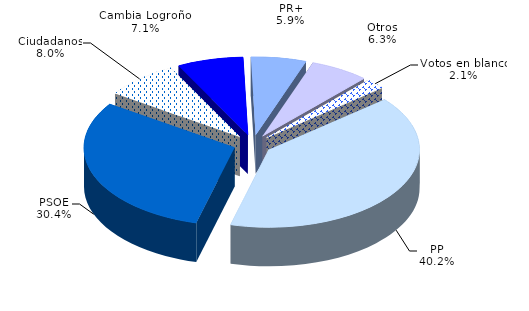
| Category | 2015 (P) |
|---|---|
| PP | 65900 |
| PSOE | 49754 |
| Ciudadanos | 13044 |
| Cambia Logroño | 11619 |
| PR+ | 9704 |
| Otros | 10377 |
| Votos en blanco | 3519 |